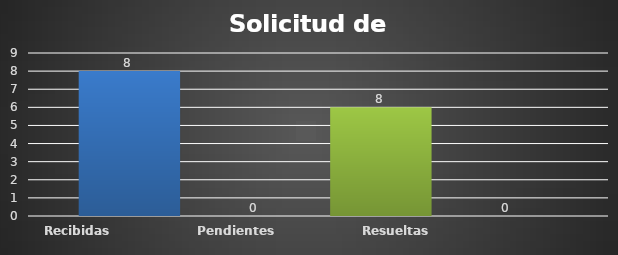
| Category | Recibidas  | Pendientes  | Resueltas | Rechazadas  |
|---|---|---|---|---|
| Recibidas  | 8 | 0 | 6 | 0 |